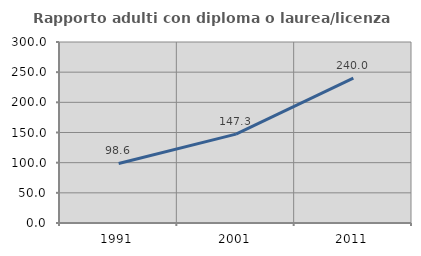
| Category | Rapporto adulti con diploma o laurea/licenza media  |
|---|---|
| 1991.0 | 98.649 |
| 2001.0 | 147.273 |
| 2011.0 | 240 |